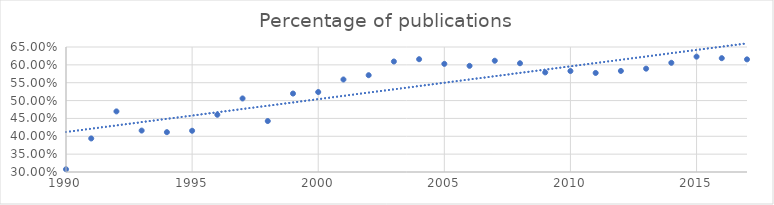
| Category | Percentage of publications |
|---|---|
| 2017.0 | 0.615 |
| 2016.0 | 0.619 |
| 2015.0 | 0.623 |
| 2014.0 | 0.606 |
| 2013.0 | 0.589 |
| 2012.0 | 0.583 |
| 2011.0 | 0.577 |
| 2010.0 | 0.583 |
| 2009.0 | 0.579 |
| 2008.0 | 0.604 |
| 2007.0 | 0.612 |
| 2006.0 | 0.597 |
| 2005.0 | 0.603 |
| 2004.0 | 0.616 |
| 2003.0 | 0.609 |
| 2002.0 | 0.571 |
| 2001.0 | 0.559 |
| 2000.0 | 0.524 |
| 1999.0 | 0.52 |
| 1998.0 | 0.443 |
| 1997.0 | 0.506 |
| 1996.0 | 0.46 |
| 1995.0 | 0.415 |
| 1994.0 | 0.412 |
| 1993.0 | 0.416 |
| 1992.0 | 0.47 |
| 1991.0 | 0.394 |
| 1990.0 | 0.308 |